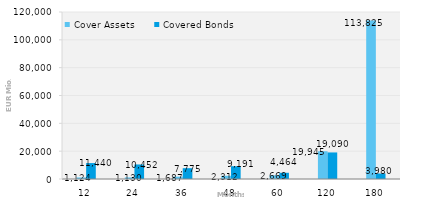
| Category | Cover Assets | Covered Bonds |
|---|---|---|
| 12.0 | 1123.561 | 11440 |
| 24.0 | 1130.019 | 10452.407 |
| 36.0 | 1687.448 | 7775 |
| 48.0 | 2311.815 | 9190.628 |
| 60.0 | 2669.479 | 4464.215 |
| 120.0 | 19945.263 | 19090 |
| 180.0 | 113825.089 | 3980.226 |